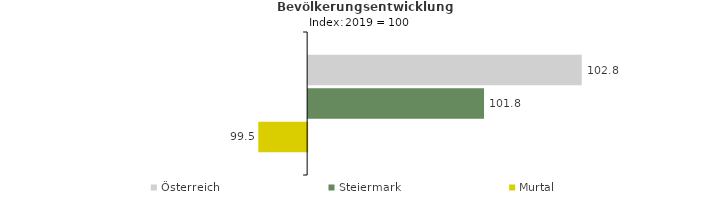
| Category | Österreich | Steiermark | Murtal |
|---|---|---|---|
| 2023.0 | 102.8 | 101.8 | 99.5 |